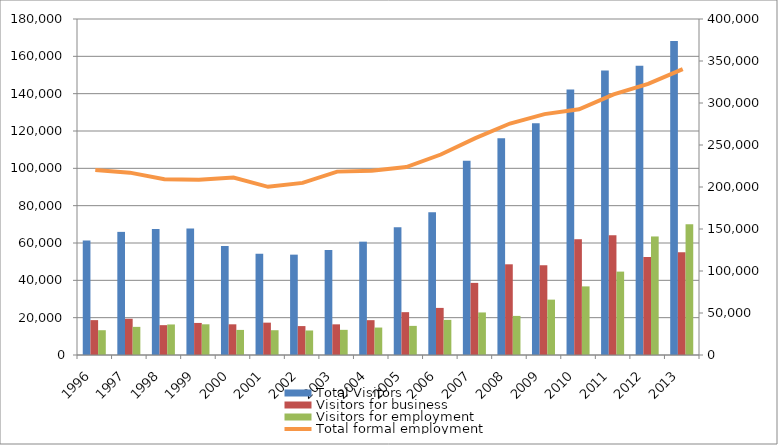
| Category | Total Visitors | Visitors for business | Visitors for employment |
|---|---|---|---|
| 1996.0 | 61392 | 18682 | 13276 |
| 1997.0 | 65960 | 19429 | 15069 |
| 1998.0 | 67545 | 15986 | 16361 |
| 1999.0 | 67816 | 17175 | 16444 |
| 2000.0 | 58448 | 16441 | 13439 |
| 2001.0 | 54235 | 17331 | 13279 |
| 2002.0 | 53762 | 15492 | 13138 |
| 2003.0 | 56282 | 16427 | 13480 |
| 2004.0 | 60715 | 18663 | 14707 |
| 2005.0 | 68450 | 22947 | 15598 |
| 2006.0 | 76504 | 25231 | 18815 |
| 2007.0 | 104122 | 38633 | 22793 |
| 2008.0 | 116158 | 48588 | 20941 |
| 2009.0 | 124199 | 48043 | 29658 |
| 2010.0 | 142178 | 62020 | 36756 |
| 2011.0 | 152454 | 64105 | 44675 |
| 2012.0 | 155008 | 52435 | 63503 |
| 2013.0 | 168212 | 55026 | 70008 |